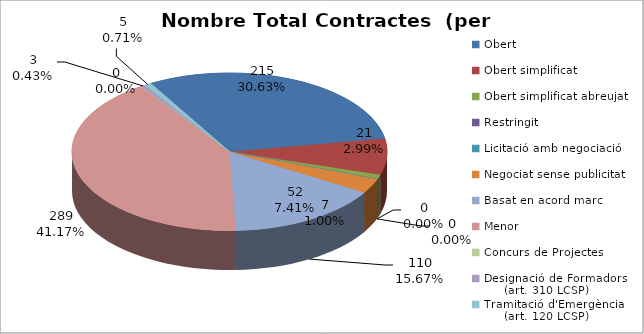
| Category | Nombre Total Contractes |
|---|---|
| Obert | 215 |
| Obert simplificat | 52 |
| Obert simplificat abreujat | 7 |
| Restringit | 0 |
| Licitació amb negociació | 0 |
| Negociat sense publicitat | 21 |
| Basat en acord marc | 110 |
| Menor | 289 |
| Concurs de Projectes | 0 |
| Designació de Formadors
     (art. 310 LCSP) | 3 |
| Tramitació d'Emergència
     (art. 120 LCSP) | 5 |